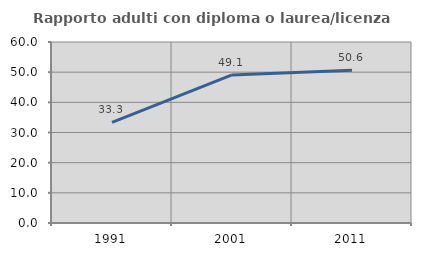
| Category | Rapporto adulti con diploma o laurea/licenza media  |
|---|---|
| 1991.0 | 33.333 |
| 2001.0 | 49.068 |
| 2011.0 | 50.61 |